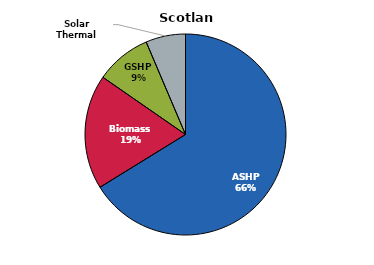
| Category | Scotland |
|---|---|
| ASHP | 13290 |
| Biomass | 3702 |
| GSHP | 1799 |
| Solar Thermal | 1284 |